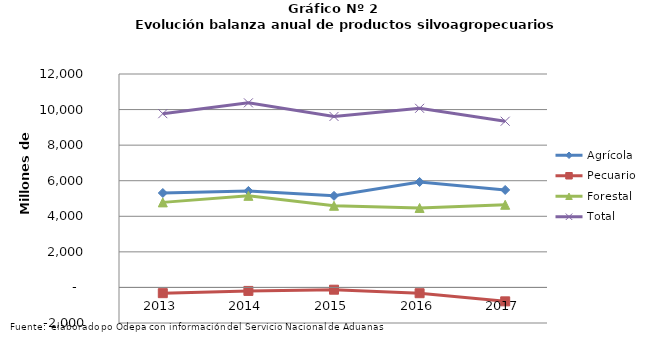
| Category | Agrícola | Pecuario | Forestal | Total |
|---|---|---|---|---|
| 2013.0 | 5309603 | -322473 | 4781973 | 9769103 |
| 2014.0 | 5424524 | -195643 | 5149868 | 10378749 |
| 2015.0 | 5149872 | -127785 | 4591408 | 9613495 |
| 2016.0 | 5928552 | -325380 | 4468117 | 10071289 |
| 2017.0 | 5479683 | -782415 | 4647025 | 9344293 |